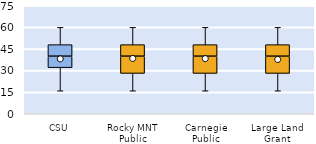
| Category | 25th | 50th | 75th |
|---|---|---|---|
| CSU | 32 | 8 | 8 |
| Rocky MNT Public | 28 | 12 | 8 |
| Carnegie Public | 28 | 12 | 8 |
| Large Land Grant | 28 | 12 | 8 |